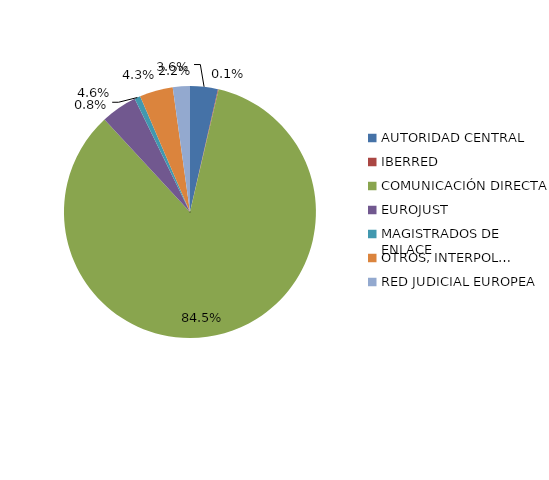
| Category | Series 0 |
|---|---|
| AUTORIDAD CENTRAL | 239 |
| IBERRED | 6 |
| COMUNICACIÓN DIRECTA | 5663 |
| EUROJUST | 311 |
| MAGISTRADOS DE ENLACE | 51 |
| OTROS, INTERPOL… | 287 |
| RED JUDICIAL EUROPEA | 147 |